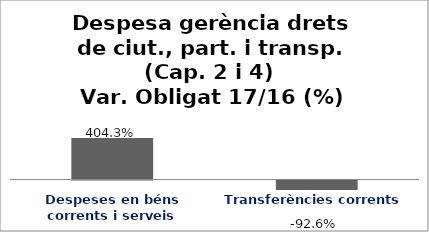
| Category | Series 0 |
|---|---|
| Despeses en béns corrents i serveis | 4.043 |
| Transferències corrents | -0.926 |